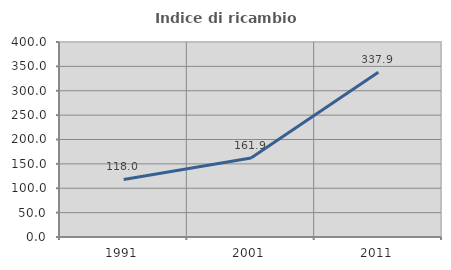
| Category | Indice di ricambio occupazionale  |
|---|---|
| 1991.0 | 118.036 |
| 2001.0 | 161.864 |
| 2011.0 | 337.917 |